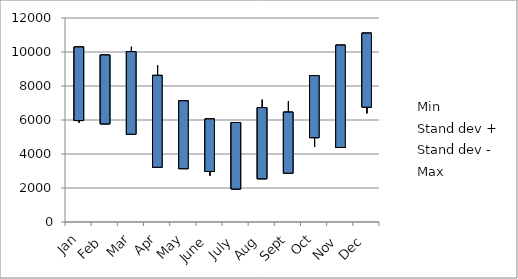
| Category | Min | Stand dev + | Stand dev - | Max |
|---|---|---|---|---|
| Jan | 5968.703 | 10197.943 | 5847.014 | 10295.153 |
| Feb | 5773.427 | 9223.805 | 5785.301 | 9821.448 |
| Mar | 5166.026 | 10305.079 | 5493.041 | 10020.626 |
| Apr | 3218.793 | 9210.281 | 4085.706 | 8623.488 |
| May | 3139.599 | 6810.105 | 3787.003 | 7127.014 |
| June | 2973.935 | 5761.315 | 2724.987 | 6060.655 |
| July | 1940.27 | 5807.763 | 2310.194 | 5853.727 |
| Aug | 2544.331 | 7192.294 | 3556.557 | 6725.519 |
| Sept | 2873.223 | 7110.686 | 3818.697 | 6461.302 |
| Oct | 4962.172 | 8095.607 | 4411.678 | 8610.202 |
| Nov | 4383.009 | 10160.537 | 4836.699 | 10403.052 |
| Dec | 6755.655 | 10548.913 | 6392.706 | 11110.827 |